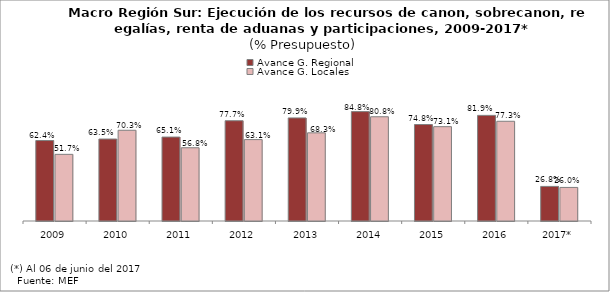
| Category | Avance G. Regional | Avance G. Locales |
|---|---|---|
| 2009 | 0.624 | 0.517 |
| 2010 | 0.635 | 0.703 |
| 2011 | 0.651 | 0.568 |
| 2012 | 0.777 | 0.631 |
| 2013 | 0.799 | 0.683 |
| 2014 | 0.848 | 0.808 |
| 2015 | 0.748 | 0.731 |
| 2016 | 0.819 | 0.773 |
| 2017* | 0.268 | 0.26 |